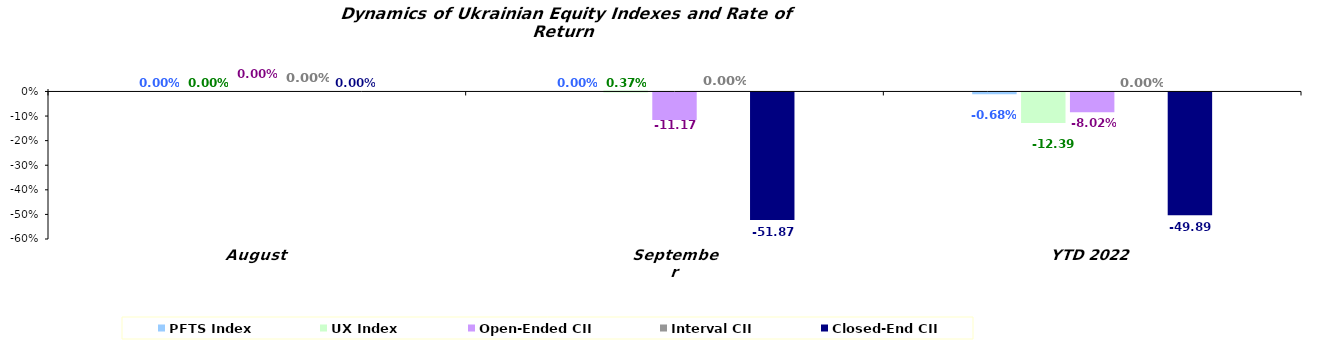
| Category | PFTS Index | UX Index | Open-Ended CII | Interval CII | Closed-End CII |
|---|---|---|---|---|---|
| August | 0 | 0 | 0 | 0 | 0 |
| September | 0 | 0.004 | -0.112 | 0 | -0.519 |
| YTD 2022 | -0.007 | -0.124 | -0.08 | 0 | -0.499 |